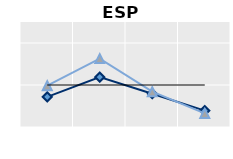
| Category | Né à l'étranger | Né dans le pays | Series 1 |
|---|---|---|---|
| 15-24 | 0.718 | 0.983 | 1 |
| 25-54 | 1.188 | 1.628 | 1 |
| 55-64 | 0.79 | 0.84 | 1 |
| 65+ | 0.389 | 0.324 | 1 |